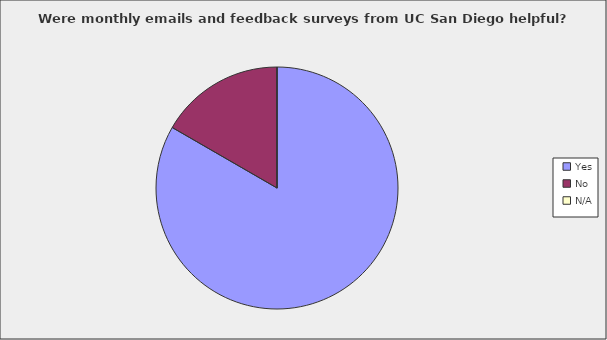
| Category | Series 0 |
|---|---|
| Yes | 0.833 |
| No  | 0.167 |
| N/A | 0 |